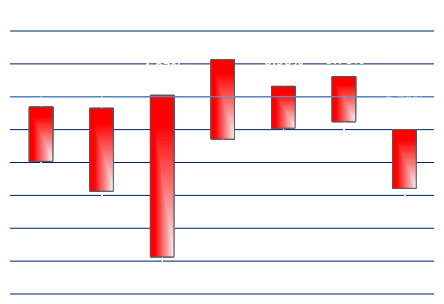
| Category | Series 0 | Series 1 | Series 2 | Series 3 |
|---|---|---|---|---|
| GCEZ19 | -0.003 | 0.001 | -0.023 | -0.02 |
| SIEZ19 | -0.004 | 0 | -0.034 | -0.029 |
| PLEF20 | 0 | 0.005 | -0.054 | -0.049 |
| CLEX19 | 0.011 | 0.012 | -0.018 | -0.013 |
| HOEX19 | 0.003 | 0.007 | -0.012 | -0.01 |
| RBEX19 | 0.006 | 0.008 | -0.013 | -0.008 |
| NGEX19 | -0.01 | -0.005 | -0.03 | -0.028 |